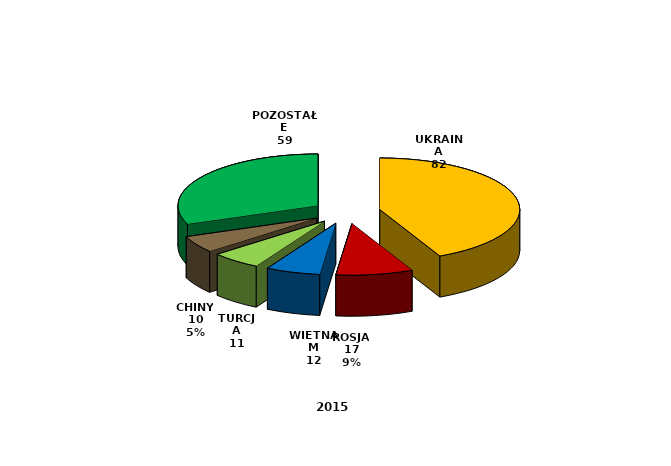
| Category | Series 0 |
|---|---|
| UKRAINA | 82 |
| ROSJA | 17 |
| WIETNAM | 12 |
| TURCJA | 11 |
| CHINY | 10 |
| POZOSTAŁE | 59 |